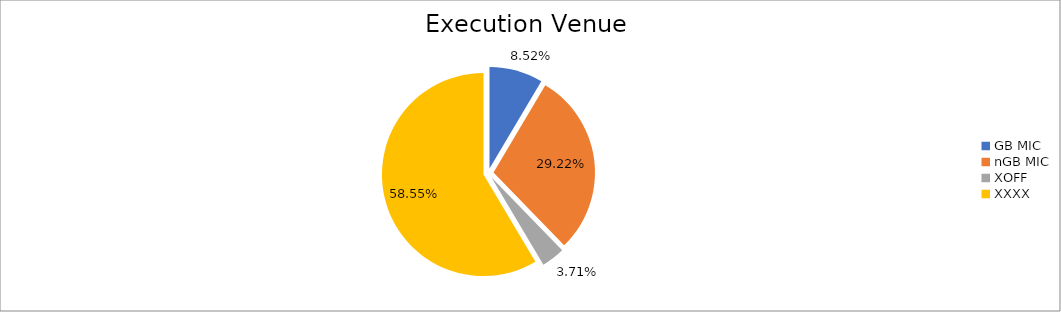
| Category | Series 0 |
|---|---|
| GB MIC | 810321.982 |
| nGB MIC | 2777893.142 |
| XOFF | 352550.5 |
| XXXX | 5565502.939 |